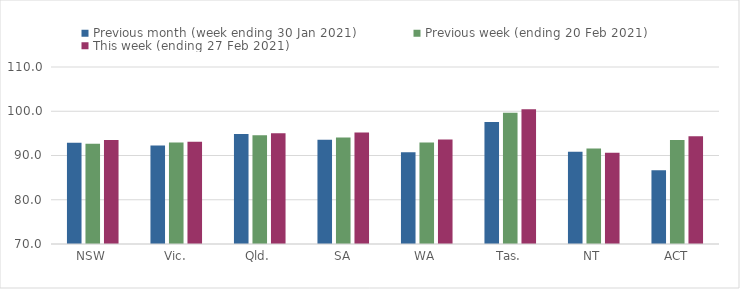
| Category | Previous month (week ending 30 Jan 2021) | Previous week (ending 20 Feb 2021) | This week (ending 27 Feb 2021) |
|---|---|---|---|
| NSW | 92.86 | 92.68 | 93.52 |
| Vic. | 92.25 | 92.96 | 93.12 |
| Qld. | 94.87 | 94.6 | 95.03 |
| SA | 93.58 | 94.05 | 95.19 |
| WA | 90.75 | 92.95 | 93.64 |
| Tas. | 97.57 | 99.65 | 100.46 |
| NT | 90.84 | 91.61 | 90.63 |
| ACT | 86.66 | 93.53 | 94.33 |